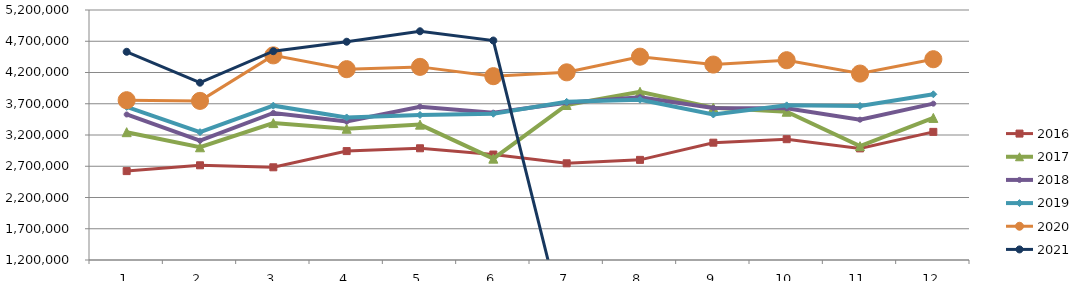
| Category | 2015 | 2016 | 2017 | 2018 | 2019 | 2020 | 2021 |
|---|---|---|---|---|---|---|---|
| 0 |  | 2622357.223 | 3245197.198 | 3528241.229 | 3649683.28 | 3756283.089 | 4531541.153 |
| 1 |  | 2715310.977 | 3003729.629 | 3108555.552 | 3245578.859 | 3745626.569 | 4037286.037 |
| 2 |  | 2683334.081 | 3390554.233 | 3553184.371 | 3669368.201 | 4474226.706 | 4540804.564 |
| 3 |  | 2942696.513 | 3299613.683 | 3414889.226 | 3480737.518 | 4252877.011 | 4692178.419 |
| 4 |  | 2987632.117 | 3365963.719 | 3653293.789 | 3520173.393 | 4289935.067 | 4859630.691 |
| 5 |  | 2887718.315 | 2821580.781 | 3557351.211 | 3540194.304 | 4141054.684 | 4711532.98 |
| 6 |  | 2747166.698 | 3679918.411 | 3714873.235 | 3730287.221 | 4202654.044 | 0 |
| 7 |  | 2802126.518 | 3891741.582 | 3805404.89 | 3764065.715 | 4452839.823 | 0 |
| 8 |  | 3077154.853 | 3637785.062 | 3633589.924 | 3528193.213 | 4326562.065 | 0 |
| 9 |  | 3132986.26 | 3572314.256 | 3626810.501 | 3674095.651 | 4396335.731 | 0 |
| 10 |  | 2985784.845 | 3021243.296 | 3445044.438 | 3664597.161 | 4182792.836 | 0 |
| 11 |  | 3249878.984 | 3473156.754 | 3701418.855 | 3851208.606 | 4412374.456 | 0 |